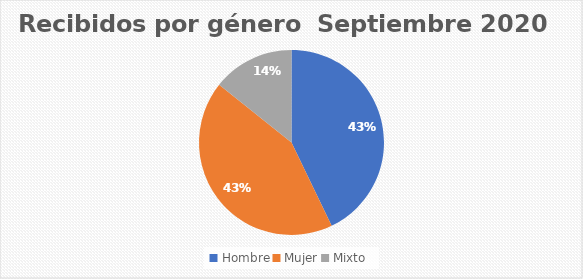
| Category | Recibidos por género  Septiembre |
|---|---|
| Hombre | 3 |
| Mujer | 3 |
| Mixto | 1 |